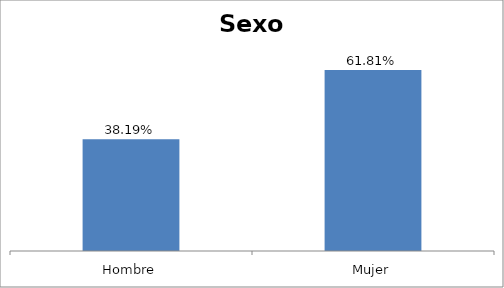
| Category | Total |
|---|---|
| Hombre | 0.382 |
| Mujer | 0.618 |